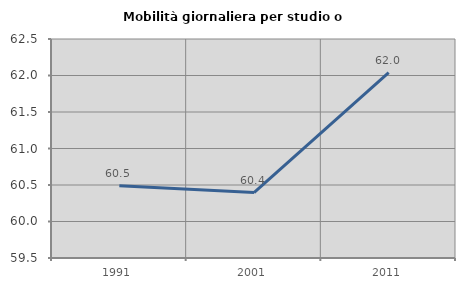
| Category | Mobilità giornaliera per studio o lavoro |
|---|---|
| 1991.0 | 60.491 |
| 2001.0 | 60.396 |
| 2011.0 | 62.039 |